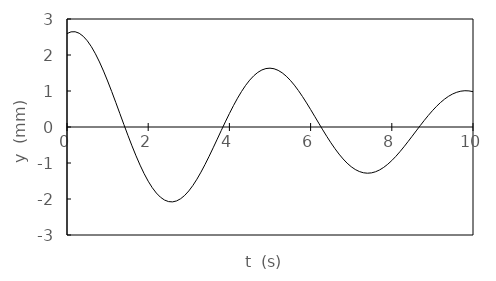
| Category | y (mm) |
|---|---|
| 0.0 | 2.595 |
| 0.1 | 2.643 |
| 0.2 | 2.646 |
| 0.3 | 2.604 |
| 0.4 | 2.52 |
| 0.5 | 2.395 |
| 0.6 | 2.231 |
| 0.7 | 2.034 |
| 0.8 | 1.807 |
| 0.9 | 1.553 |
| 1.0 | 1.279 |
| 1.1 | 0.988 |
| 1.2 | 0.687 |
| 1.3 | 0.38 |
| 1.4 | 0.072 |
| 1.5 | -0.23 |
| 1.6 | -0.523 |
| 1.7 | -0.801 |
| 1.8 | -1.06 |
| 1.9 | -1.296 |
| 2.0 | -1.506 |
| 2.1 | -1.686 |
| 2.2 | -1.834 |
| 2.3 | -1.949 |
| 2.4 | -2.028 |
| 2.5 | -2.072 |
| 2.6 | -2.08 |
| 2.7 | -2.053 |
| 2.8 | -1.992 |
| 2.9 | -1.899 |
| 3.0 | -1.776 |
| 3.1 | -1.625 |
| 3.2 | -1.45 |
| 3.3 | -1.254 |
| 3.4 | -1.041 |
| 3.5 | -0.815 |
| 3.6 | -0.579 |
| 3.7 | -0.338 |
| 3.8 | -0.097 |
| 3.9 | 0.142 |
| 4.0 | 0.373 |
| 4.1 | 0.594 |
| 4.2 | 0.8 |
| 4.3 | 0.988 |
| 4.4 | 1.157 |
| 4.5 | 1.302 |
| 4.6 | 1.423 |
| 4.7 | 1.517 |
| 4.8 | 1.584 |
| 4.9 | 1.623 |
| 5.0 | 1.634 |
| 5.1 | 1.618 |
| 5.2 | 1.574 |
| 5.3 | 1.505 |
| 5.4 | 1.412 |
| 5.5 | 1.297 |
| 5.6 | 1.163 |
| 5.7 | 1.011 |
| 5.8 | 0.846 |
| 5.9 | 0.67 |
| 6.0 | 0.486 |
| 6.1 | 0.297 |
| 6.2 | 0.107 |
| 6.3 | -0.081 |
| 6.4 | -0.263 |
| 6.5 | -0.438 |
| 6.6 | -0.602 |
| 6.7 | -0.753 |
| 6.8 | -0.887 |
| 6.9 | -1.005 |
| 7.0 | -1.103 |
| 7.1 | -1.181 |
| 7.2 | -1.237 |
| 7.3 | -1.271 |
| 7.4 | -1.284 |
| 7.5 | -1.274 |
| 7.6 | -1.243 |
| 7.7 | -1.192 |
| 7.8 | -1.122 |
| 7.9 | -1.035 |
| 8.0 | -0.932 |
| 8.1 | -0.815 |
| 8.2 | -0.687 |
| 8.3 | -0.549 |
| 8.4 | -0.406 |
| 8.5 | -0.258 |
| 8.6 | -0.109 |
| 8.7 | 0.039 |
| 8.8 | 0.183 |
| 8.9 | 0.322 |
| 9.0 | 0.452 |
| 9.1 | 0.572 |
| 9.2 | 0.68 |
| 9.3 | 0.775 |
| 9.4 | 0.854 |
| 9.5 | 0.918 |
| 9.6 | 0.965 |
| 9.7 | 0.995 |
| 9.8 | 1.008 |
| 9.9 | 1.003 |
| 10.0 | 0.982 |